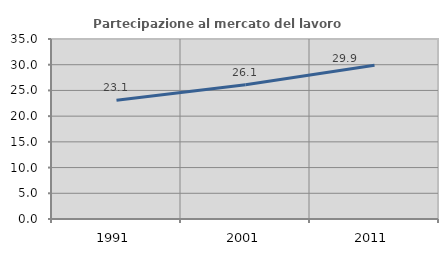
| Category | Partecipazione al mercato del lavoro  femminile |
|---|---|
| 1991.0 | 23.101 |
| 2001.0 | 26.125 |
| 2011.0 | 29.911 |